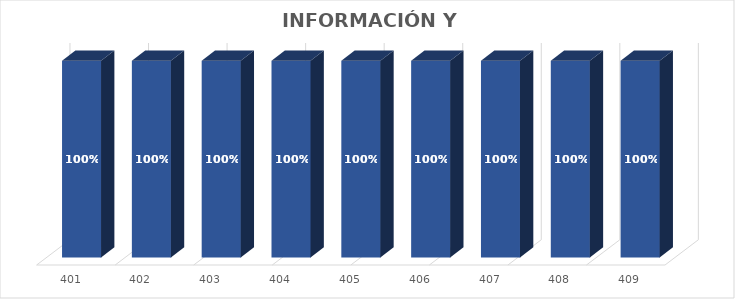
| Category | % Avance |
|---|---|
| 401.0 | 1 |
| 402.0 | 1 |
| 403.0 | 1 |
| 404.0 | 1 |
| 405.0 | 1 |
| 406.0 | 1 |
| 407.0 | 1 |
| 408.0 | 1 |
| 409.0 | 1 |